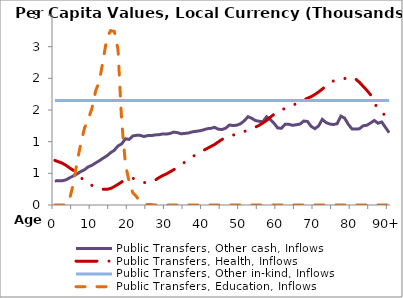
| Category | Public Transfers, Other cash, Inflows | Public Transfers, Health, Inflows | Public Transfers, Other in-kind, Inflows | Public Transfers, Education, Inflows |
|---|---|---|---|---|
| 0 | 380.429 | 704.291 | 1648.652 | 0 |
|  | 381.806 | 682.238 | 1648.652 | 0 |
| 2 | 383.182 | 660.185 | 1648.652 | 0 |
| 3 | 396.853 | 626.807 | 1648.652 | 0 |
| 4 | 430.007 | 584.403 | 1648.652 | 99.515 |
| 5 | 459.46 | 545.603 | 1648.652 | 344.686 |
| 6 | 490.847 | 483.741 | 1648.652 | 681.886 |
| 7 | 528.777 | 430.533 | 1648.652 | 973.07 |
| 8 | 557.55 | 387.608 | 1648.652 | 1219.418 |
| 9 | 602.621 | 349.121 | 1648.652 | 1352.168 |
| 10 | 627.128 | 308.591 | 1648.652 | 1530.348 |
| 11 | 665.052 | 283.511 | 1648.652 | 1806.449 |
| 12 | 700.159 | 264.921 | 1648.652 | 1953.814 |
| 13 | 740.038 | 248.766 | 1648.652 | 2292.134 |
| 14 | 775.6 | 247.469 | 1648.652 | 2632.075 |
| 15 | 825.786 | 260.737 | 1648.652 | 2753.252 |
| 16 | 864.277 | 290.456 | 1648.652 | 2741.037 |
| 17 | 932.382 | 326.402 | 1648.652 | 2455.303 |
| 18 | 966.218 | 363.775 | 1648.652 | 1311.603 |
| 19 | 1045.641 | 405.235 | 1648.652 | 643.488 |
| 20 | 1035.661 | 418.395 | 1648.652 | 364.876 |
| 21 | 1090.026 | 422.107 | 1648.652 | 191.042 |
| 22 | 1100.037 | 400.752 | 1648.652 | 131.544 |
| 23 | 1099.165 | 377.772 | 1648.652 | 45.703 |
| 24 | 1081.089 | 355.621 | 1648.652 | 15.696 |
| 25 | 1096.416 | 349.948 | 1648.652 | 7.679 |
| 26 | 1095.431 | 363.134 | 1648.652 | 5.841 |
| 27 | 1106.756 | 392.186 | 1648.652 | 0 |
| 28 | 1109.564 | 430.999 | 1648.652 | 0 |
| 29 | 1121.938 | 463.631 | 1648.652 | 0 |
| 30 | 1119.374 | 489.466 | 1648.652 | 0 |
| 31 | 1128.922 | 523.551 | 1648.652 | 0 |
| 32 | 1151.001 | 557.53 | 1648.652 | 0 |
| 33 | 1142.469 | 589.861 | 1648.652 | 0 |
| 34 | 1124.294 | 630.887 | 1648.652 | 0 |
| 35 | 1129.864 | 678.016 | 1648.652 | 0 |
| 36 | 1137.484 | 716.064 | 1648.652 | 0 |
| 37 | 1154.621 | 755.856 | 1648.652 | 0 |
| 38 | 1163.566 | 799.741 | 1648.652 | 0 |
| 39 | 1171.442 | 836.279 | 1648.652 | 0 |
| 40 | 1185.696 | 863.041 | 1648.652 | 0 |
| 41 | 1204.384 | 892.63 | 1648.652 | 0 |
| 42 | 1210.574 | 924.144 | 1648.652 | 0 |
| 43 | 1226.893 | 955.646 | 1648.652 | 0 |
| 44 | 1196.385 | 995.895 | 1648.652 | 0 |
| 45 | 1192.441 | 1034.582 | 1648.652 | 0 |
| 46 | 1213.287 | 1067.43 | 1648.652 | 0 |
| 47 | 1263.778 | 1089.04 | 1648.652 | 0 |
| 48 | 1253.926 | 1103.673 | 1648.652 | 0 |
| 49 | 1259.872 | 1128.411 | 1648.652 | 0 |
| 50 | 1283.924 | 1145.895 | 1648.652 | 0 |
| 51 | 1328.81 | 1160.826 | 1648.652 | 0 |
| 52 | 1394.739 | 1183.363 | 1648.652 | 0 |
| 53 | 1369.405 | 1202.345 | 1648.652 | 0 |
| 54 | 1333.328 | 1229.195 | 1648.652 | 0 |
| 55 | 1321.602 | 1258.339 | 1648.652 | 0 |
| 56 | 1314.665 | 1294.74 | 1648.652 | 0 |
| 57 | 1392.931 | 1334.287 | 1648.652 | 0 |
| 58 | 1350.637 | 1385.194 | 1648.652 | 0 |
| 59 | 1291.079 | 1431.848 | 1648.652 | 0 |
| 60 | 1216.279 | 1473.116 | 1648.652 | 0 |
| 61 | 1211.517 | 1504.516 | 1648.652 | 0 |
| 62 | 1275.495 | 1523.856 | 1648.652 | 0 |
| 63 | 1273.303 | 1548.101 | 1648.652 | 0 |
| 64 | 1257.798 | 1573.421 | 1648.652 | 0 |
| 65 | 1267.104 | 1599.81 | 1648.652 | 0 |
| 66 | 1277.581 | 1629.209 | 1648.652 | 0 |
| 67 | 1325.393 | 1657.752 | 1648.652 | 0 |
| 68 | 1319.54 | 1685.763 | 1648.652 | 0 |
| 69 | 1241.635 | 1710.402 | 1648.652 | 0 |
| 70 | 1204.893 | 1745.309 | 1648.652 | 0 |
| 71 | 1247.637 | 1784.451 | 1648.652 | 0 |
| 72 | 1352.449 | 1830.524 | 1648.652 | 0 |
| 73 | 1302.289 | 1878.565 | 1648.652 | 0 |
| 74 | 1278.094 | 1921.295 | 1648.652 | 0 |
| 75 | 1270.909 | 1959.071 | 1648.652 | 0 |
| 76 | 1283.614 | 1972.589 | 1648.652 | 0 |
| 77 | 1402.703 | 1981.801 | 1648.652 | 0 |
| 78 | 1373.095 | 1995.739 | 1648.652 | 0 |
| 79 | 1273.916 | 2014.159 | 1648.652 | 0 |
| 80 | 1201.165 | 2017.455 | 1648.652 | 0 |
| 81 | 1198.206 | 1987.879 | 1648.652 | 0 |
| 82 | 1203.667 | 1937.747 | 1648.652 | 0 |
| 83 | 1250.931 | 1873.056 | 1648.652 | 0 |
| 84 | 1259.401 | 1811.216 | 1648.652 | 0 |
| 85 | 1294.622 | 1740.649 | 1648.652 | 0 |
| 86 | 1334.989 | 1621.005 | 1648.652 | 0 |
| 87 | 1290.706 | 1507.779 | 1648.652 | 0 |
| 88 | 1311.151 | 1460.596 | 1648.652 | 0 |
| 89 | 1226.567 | 1414.242 | 1648.652 | 0 |
| 90+ | 1141.983 | 1367.889 | 1648.652 | 0 |